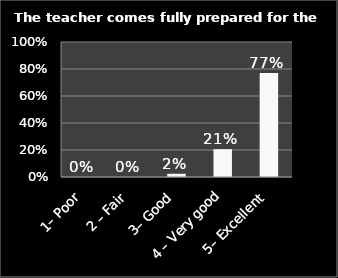
| Category | Series 0 |
|---|---|
| 1– Poor | 0 |
| 2 – Fair | 0 |
| 3– Good | 0.024 |
| 4 – Very good | 0.206 |
| 5– Excellent | 0.77 |